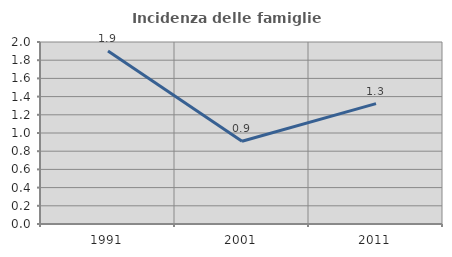
| Category | Incidenza delle famiglie numerose |
|---|---|
| 1991.0 | 1.902 |
| 2001.0 | 0.909 |
| 2011.0 | 1.323 |